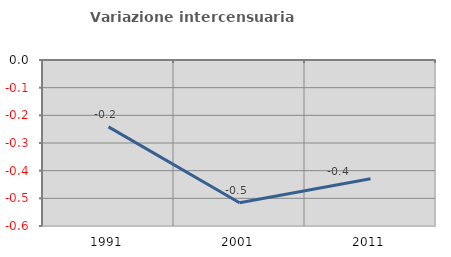
| Category | Variazione intercensuaria annua |
|---|---|
| 1991.0 | -0.242 |
| 2001.0 | -0.516 |
| 2011.0 | -0.429 |